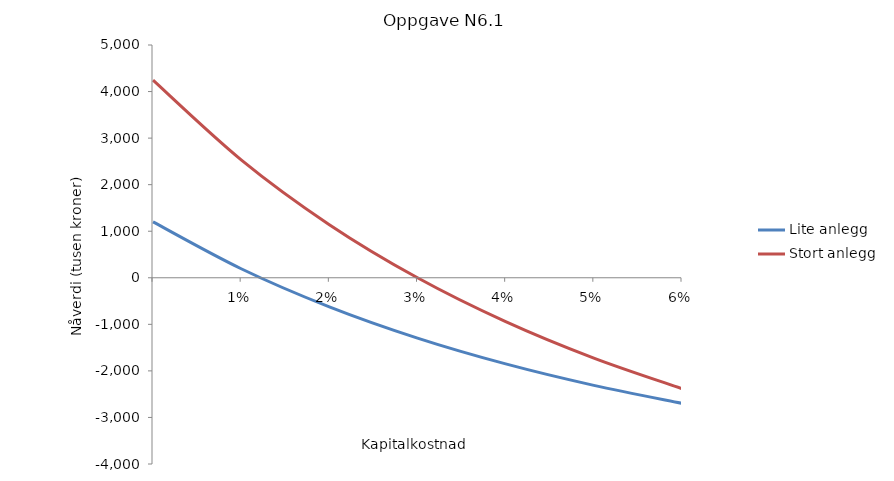
| Category | Lite anlegg | Stort anlegg |
|---|---|---|
| nan | 1200 | 4244.622 |
| 0.01 | 193.85 | 2533.521 |
| 0.02 | -624.851 | 1141.205 |
| 0.03 | -1295.894 | 0 |
| 0.04 | -1849.912 | -942.186 |
| 0.05 | -2310.612 | -1725.671 |
| 0.060000000000000005 | -2696.441 | -2381.828 |